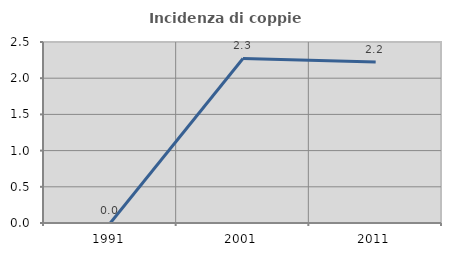
| Category | Incidenza di coppie miste |
|---|---|
| 1991.0 | 0 |
| 2001.0 | 2.273 |
| 2011.0 | 2.222 |